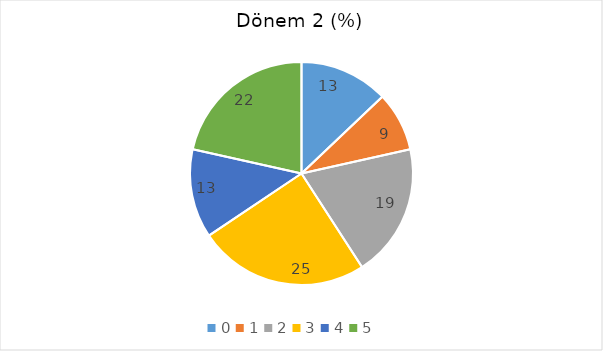
| Category | Dönem 2 (%) |
|---|---|
| 0.0 | 12.903 |
| 1.0 | 8.602 |
| 2.0 | 19.355 |
| 3.0 | 24.731 |
| 4.0 | 12.903 |
| 5.0 | 21.505 |